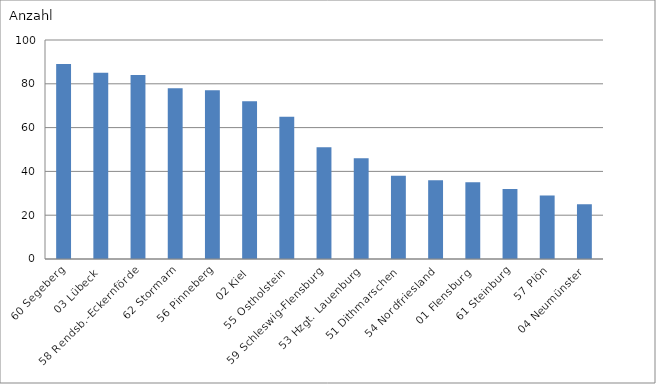
| Category | 60 Segeberg |
|---|---|
| 60 Segeberg | 89 |
| 03 Lübeck | 85 |
| 58 Rendsb.-Eckernförde | 84 |
| 62 Stormarn | 78 |
| 56 Pinneberg | 77 |
| 02 Kiel | 72 |
| 55 Ostholstein | 65 |
| 59 Schleswig-Flensburg | 51 |
| 53 Hzgt. Lauenburg | 46 |
| 51 Dithmarschen | 38 |
| 54 Nordfriesland | 36 |
| 01 Flensburg | 35 |
| 61 Steinburg | 32 |
| 57 Plön | 29 |
| 04 Neumünster | 25 |